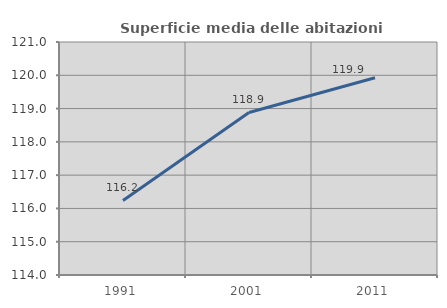
| Category | Superficie media delle abitazioni occupate |
|---|---|
| 1991.0 | 116.241 |
| 2001.0 | 118.883 |
| 2011.0 | 119.925 |